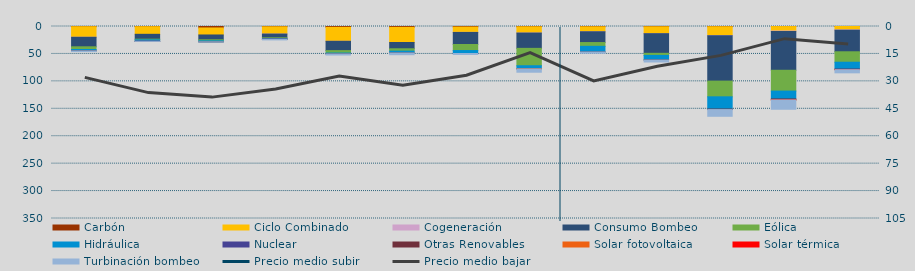
| Category | Carbón | Ciclo Combinado | Cogeneración | Consumo Bombeo | Eólica | Hidráulica | Nuclear | Otras Renovables | Solar fotovoltaica | Solar térmica | Turbinación bombeo |
|---|---|---|---|---|---|---|---|---|---|---|---|
| M | 361.5 | 19230.2 | 80.6 | 17332.6 | 4925.2 | 2441.8 | 0 | 127.2 | 0 | 0 | 1259.2 |
| J | 346.1 | 13888.5 | 0 | 8869 | 1186.7 | 2488.5 | 187.1 | 15.9 | 0 | 0 | 184.3 |
| J | 2658.9 | 12785.9 | 0 | 8749.3 | 1887.5 | 1893.1 | 0 | 9.8 | 0 | 0 | 57.5 |
| A | 567.2 | 13236.4 | 10 | 6766.4 | 1241.9 | 1156.9 | 173 | 38 | 0 | 0 | 1232.6 |
| S | 1539.8 | 25452.8 | 8.7 | 16928.4 | 4457.4 | 1540.4 | 0 | 149.5 | 0 | 0 | 1916.2 |
| O | 1567.5 | 27564.7 | 0 | 11468.6 | 4269.6 | 3292.2 | 0 | 125.3 | 0 | 0 | 3130.6 |
| N | 1032.3 | 9659.8 | 141 | 22022.6 | 10965.1 | 5345.6 | 22.6 | 8.3 | 0 | 0 | 1780.7 |
| D | 528.1 | 11341.1 | 86.5 | 27911.2 | 31665.4 | 5608.2 | 0 | 173.7 | 5.9 | 0 | 6026.2 |
| E | 543.5 | 9049.8 | 14.2 | 19673 | 6854.8 | 10347.8 | 0 | 7.7 | 0 | 0 | 2307.6 |
| F | 538.4 | 12495.4 | 57.7 | 35793.2 | 3820.7 | 8168.3 | 0 | 265.3 | 0 | 0 | 3575.3 |
| M | 386.4 | 15979.9 | 321.7 | 82837 | 28654.5 | 22332.5 | 0 | 917.9 | 0 | 0 | 12258.3 |
| A | 97.2 | 8073.6 | 752.2 | 70876 | 37936.3 | 14340.4 | 0 | 1671.6 | 79.6 | 6.4 | 17035.3 |
| M | 18.3 | 6034.6 | 724.9 | 39295.9 | 19044.2 | 12773.5 | 8 | 691.1 | 39.5 | 82.2 | 5747.6 |